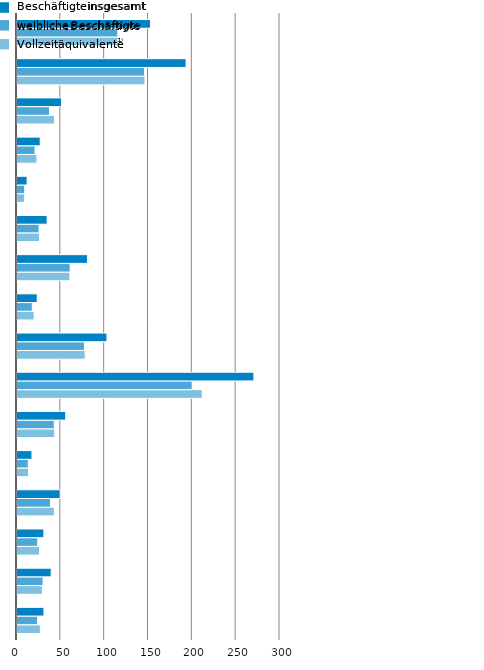
| Category | VZÄ | wB | iB |
|---|---|---|---|
| Thüringen      | 26.662 | 23.586 | 30.751 |
| Schleswig-Holstein | 28.951 | 29.733 | 39.004 |
| Sachsen-Anhalt | 25.715 | 23.719 | 30.702 |
| Sachsen        | 42.594 | 38.297 | 49.281 |
| Saarland | 13.174 | 12.885 | 17.063 |
| Rheinland-Pfalz | 43.048 | 42.5 | 55.6 |
| Nordrhein-Westfalen | 211.272 | 199.846 | 270.226 |
| Niedersachsen | 77.722 | 77.056 | 102.639 |
| Mecklenburg-Vorpommern | 19.458 | 17.425 | 23.033 |
| Hessen         | 60.241 | 60.644 | 80.394 |
| Hamburg | 25.694 | 25.18 | 34.346 |
| Bremen | 8.775 | 8.794 | 11.51 |
| Brandenburg | 22.748 | 20.611 | 26.499 |
| Berlin | 42.716 | 37.119 | 50.826 |
| Bayern | 145.957 | 145.563 | 192.863 |
| Baden-Württemberg | 115.274 | 115.042 | 152.266 |